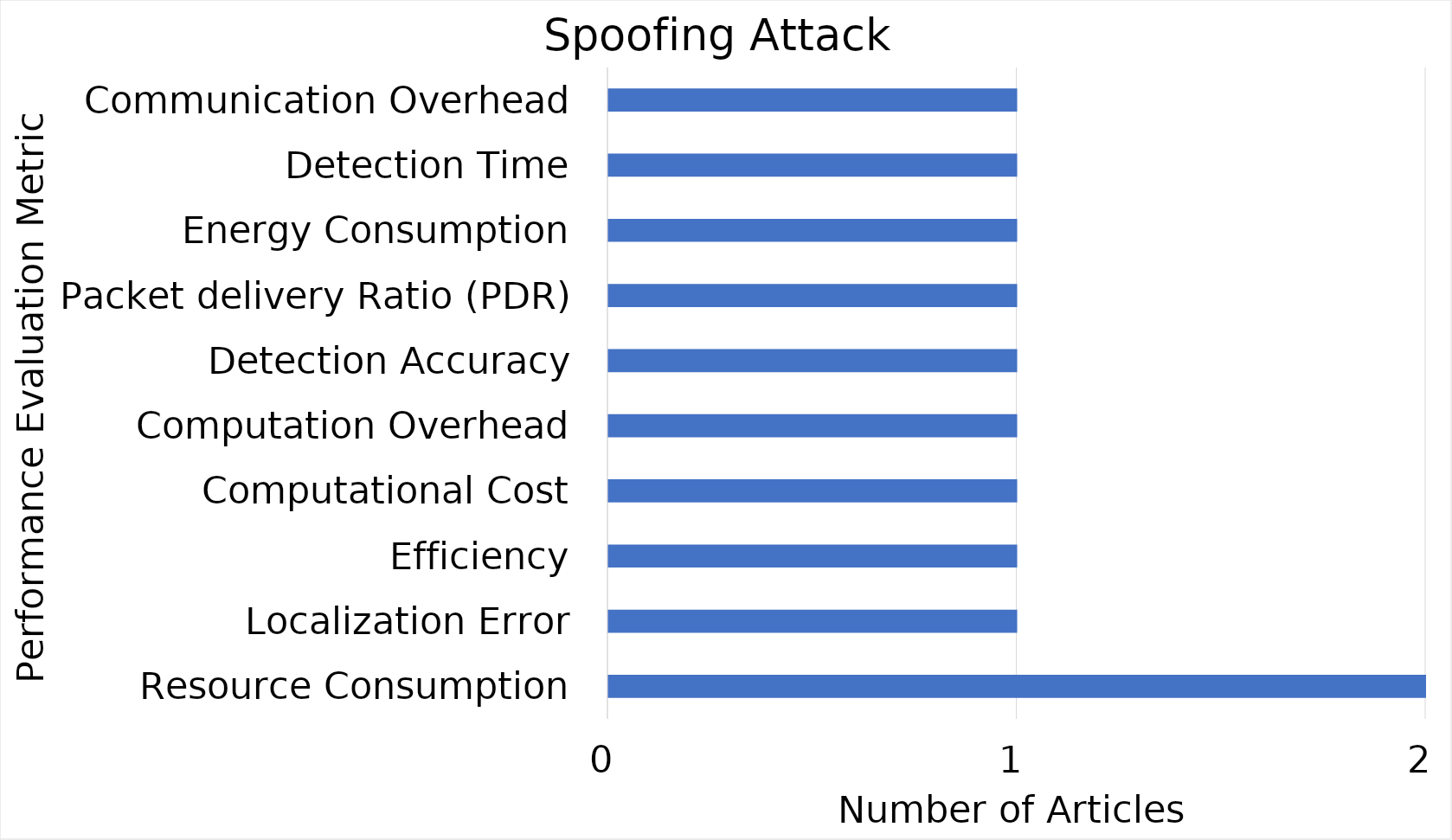
| Category | Spoofing |
|---|---|
| Resource Consumption | 2 |
| Localization Error | 1 |
| Efficiency | 1 |
| Computational Cost | 1 |
| Computation Overhead | 1 |
| Detection Accuracy | 1 |
| Packet delivery Ratio (PDR) | 1 |
| Energy Consumption | 1 |
| Detection Time | 1 |
| Communication Overhead | 1 |